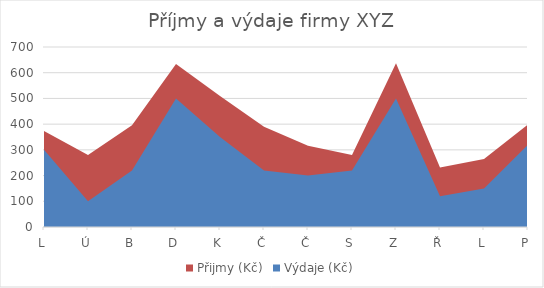
| Category | Přijmy (Kč) | Výdaje (Kč) |
|---|---|---|
| L | 373 | 300 |
| Ú | 280 | 100 |
| B | 396 | 220 |
| D | 634 | 500 |
| K | 509 | 350 |
| Č | 390 | 220 |
| Č | 316 | 200 |
| S | 280 | 220 |
| Z | 637 | 500 |
| Ř | 231 | 120 |
| L | 264 | 150 |
| P | 399 | 320 |